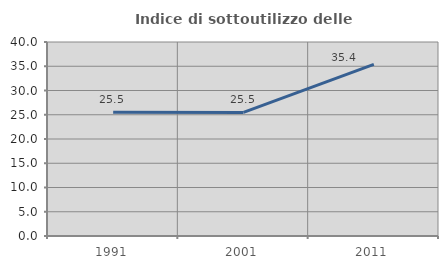
| Category | Indice di sottoutilizzo delle abitazioni  |
|---|---|
| 1991.0 | 25.513 |
| 2001.0 | 25.485 |
| 2011.0 | 35.398 |